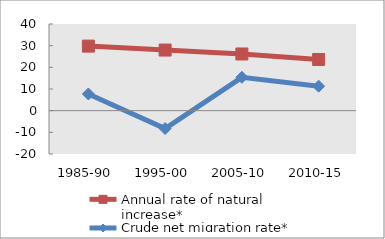
| Category | Annual rate of natural increase* | Crude net migration rate* |
|---|---|---|
| 1985-90 | 29.79 | 7.699 |
| 1995-00 | 27.976 | -8.287 |
| 2005-10 | 26.168 | 15.396 |
| 2010-15 | 23.619 | 11.312 |